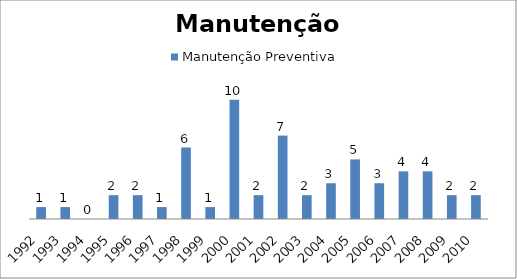
| Category | Manutenção Preventiva |
|---|---|
| 1992.0 | 1 |
| 1993.0 | 1 |
| 1994.0 | 0 |
| 1995.0 | 2 |
| 1996.0 | 2 |
| 1997.0 | 1 |
| 1998.0 | 6 |
| 1999.0 | 1 |
| 2000.0 | 10 |
| 2001.0 | 2 |
| 2002.0 | 7 |
| 2003.0 | 2 |
| 2004.0 | 3 |
| 2005.0 | 5 |
| 2006.0 | 3 |
| 2007.0 | 4 |
| 2008.0 | 4 |
| 2009.0 | 2 |
| 2010.0 | 2 |